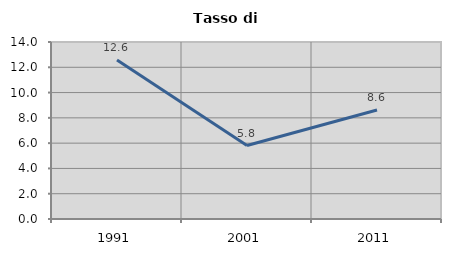
| Category | Tasso di disoccupazione   |
|---|---|
| 1991.0 | 12.575 |
| 2001.0 | 5.808 |
| 2011.0 | 8.624 |